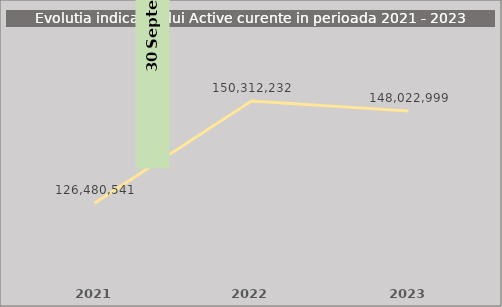
| Category | Series 0 |
|---|---|
| 2021.0 | 126480540.967 |
| 2022.0 | 150312232.415 |
| 2023.0 | 148022999 |